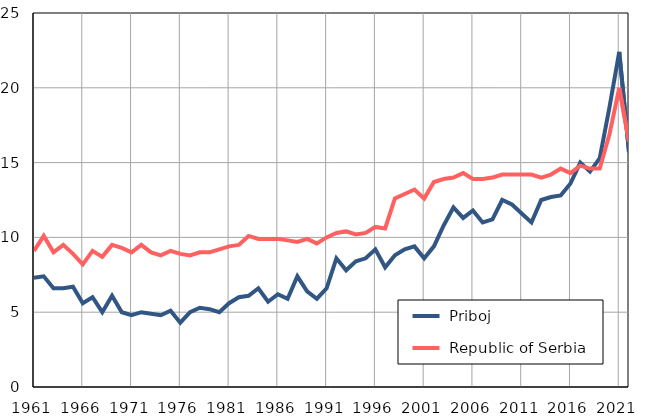
| Category |  Priboj |  Republic of Serbia |
|---|---|---|
| 1961.0 | 7.3 | 9.1 |
| 1962.0 | 7.4 | 10.1 |
| 1963.0 | 6.6 | 9 |
| 1964.0 | 6.6 | 9.5 |
| 1965.0 | 6.7 | 8.9 |
| 1966.0 | 5.6 | 8.2 |
| 1967.0 | 6 | 9.1 |
| 1968.0 | 5 | 8.7 |
| 1969.0 | 6.1 | 9.5 |
| 1970.0 | 5 | 9.3 |
| 1971.0 | 4.8 | 9 |
| 1972.0 | 5 | 9.5 |
| 1973.0 | 4.9 | 9 |
| 1974.0 | 4.8 | 8.8 |
| 1975.0 | 5.1 | 9.1 |
| 1976.0 | 4.3 | 8.9 |
| 1977.0 | 5 | 8.8 |
| 1978.0 | 5.3 | 9 |
| 1979.0 | 5.2 | 9 |
| 1980.0 | 5 | 9.2 |
| 1981.0 | 5.6 | 9.4 |
| 1982.0 | 6 | 9.5 |
| 1983.0 | 6.1 | 10.1 |
| 1984.0 | 6.6 | 9.9 |
| 1985.0 | 5.7 | 9.9 |
| 1986.0 | 6.2 | 9.9 |
| 1987.0 | 5.9 | 9.8 |
| 1988.0 | 7.4 | 9.7 |
| 1989.0 | 6.4 | 9.9 |
| 1990.0 | 5.9 | 9.6 |
| 1991.0 | 6.6 | 10 |
| 1992.0 | 8.6 | 10.3 |
| 1993.0 | 7.8 | 10.4 |
| 1994.0 | 8.4 | 10.2 |
| 1995.0 | 8.6 | 10.3 |
| 1996.0 | 9.2 | 10.7 |
| 1997.0 | 8 | 10.6 |
| 1998.0 | 8.8 | 12.6 |
| 1999.0 | 9.2 | 12.9 |
| 2000.0 | 9.4 | 13.2 |
| 2001.0 | 8.6 | 12.6 |
| 2002.0 | 9.4 | 13.7 |
| 2003.0 | 10.8 | 13.9 |
| 2004.0 | 12 | 14 |
| 2005.0 | 11.3 | 14.3 |
| 2006.0 | 11.8 | 13.9 |
| 2007.0 | 11 | 13.9 |
| 2008.0 | 11.2 | 14 |
| 2009.0 | 12.5 | 14.2 |
| 2010.0 | 12.2 | 14.2 |
| 2011.0 | 11.6 | 14.2 |
| 2012.0 | 11 | 14.2 |
| 2013.0 | 12.5 | 14 |
| 2014.0 | 12.7 | 14.2 |
| 2015.0 | 12.8 | 14.6 |
| 2016.0 | 13.6 | 14.3 |
| 2017.0 | 15 | 14.8 |
| 2018.0 | 14.4 | 14.6 |
| 2019.0 | 15.3 | 14.6 |
| 2020.0 | 18.7 | 16.9 |
| 2021.0 | 22.4 | 20 |
| 2022.0 | 15.7 | 16.4 |